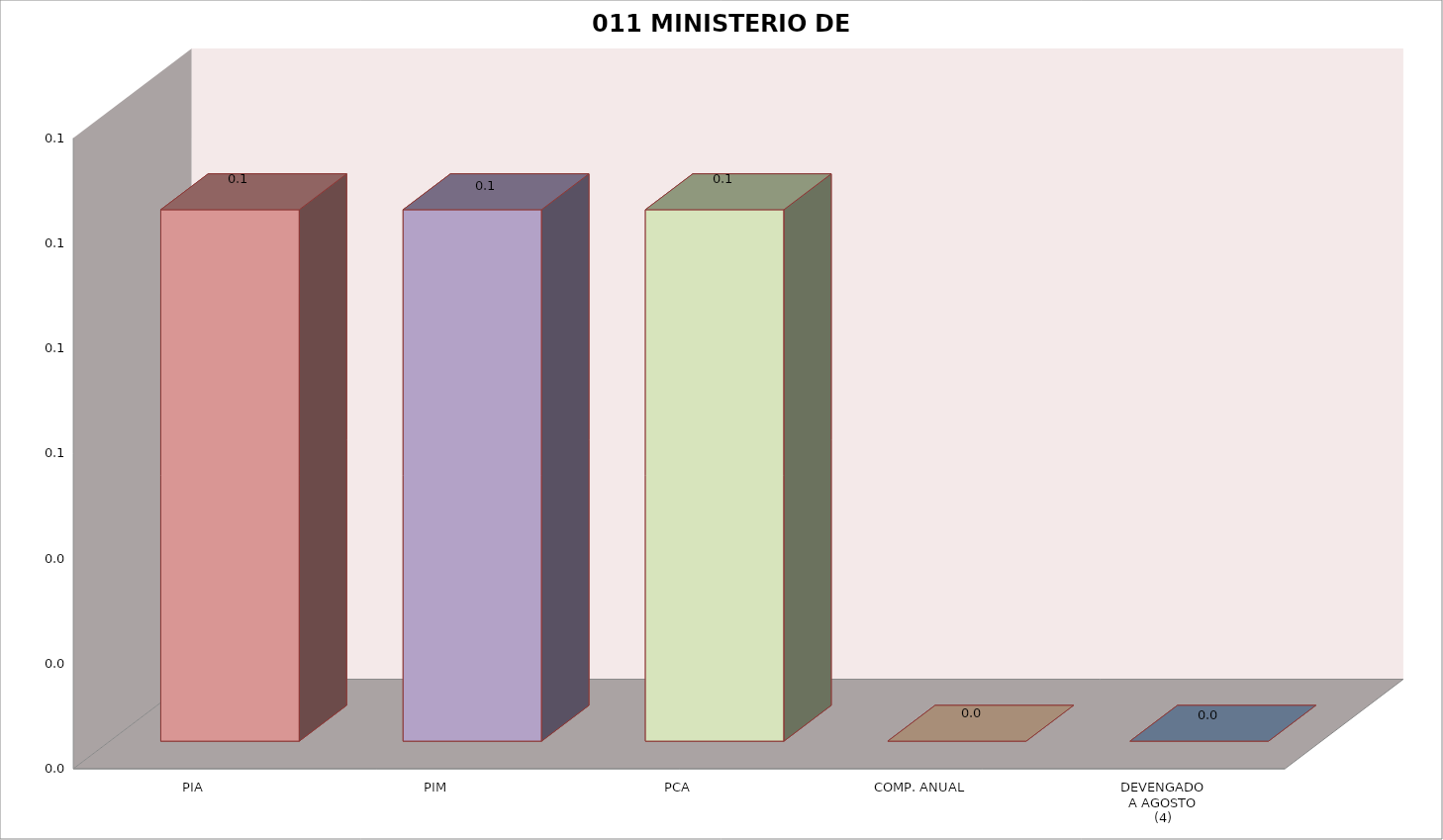
| Category | 011 MINISTERIO DE SALUD |
|---|---|
| PIA | 0.101 |
| PIM | 0.101 |
| PCA | 0.101 |
| COMP. ANUAL | 0 |
| DEVENGADO
A AGOSTO
(4) | 0 |